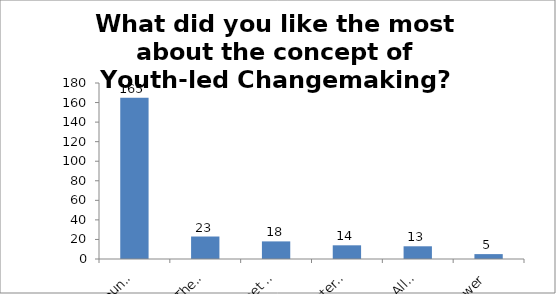
| Category | What did you like the most about the concept of Youth-led Changemaking? |
|---|---|
| It Activates Young People As Changemakers | 165 |
| It Redefines The Field Of Youth Development | 23 |
| It Meets Unmet Service Needs Of The Society | 18 |
| It Aims At Enterprising Education | 14 |
| It Focuses On All (Troubled And Prepared) Young People | 13 |
| No Answer | 5 |